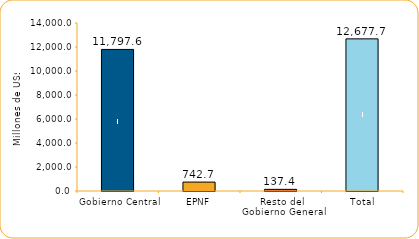
| Category | Series 1 |
|---|---|
| Gobierno Central | 11797.6 |
| EPNF | 742.7 |
| Resto del Gobierno General | 137.4 |
| Total | 12677.7 |